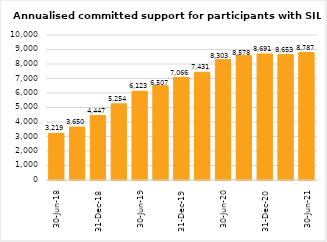
| Category | Annualised committed support for participants with SIL ($m) |
|---|---|
| 2018-06-30 | 3219032002.667 |
| 2018-09-30 | 3650332894.326 |
| 2018-12-31 | 4447217507.254 |
| 2019-03-31 | 5253620825.545 |
| 2019-06-30 | 6122777342.347 |
| 2019-09-30 | 6506577060.389 |
| 2019-12-31 | 7066035970.243 |
| 2020-03-31 | 7430956387.835 |
| 2020-06-30 | 8303176962.1 |
| 2020-09-30 | 8577535395.513 |
| 2020-12-31 | 8690827791.857 |
| 2021-03-31 | 8653456463.69 |
| 2021-06-30 | 8787344615.703 |